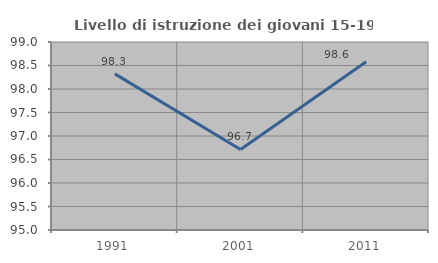
| Category | Livello di istruzione dei giovani 15-19 anni |
|---|---|
| 1991.0 | 98.322 |
| 2001.0 | 96.714 |
| 2011.0 | 98.578 |